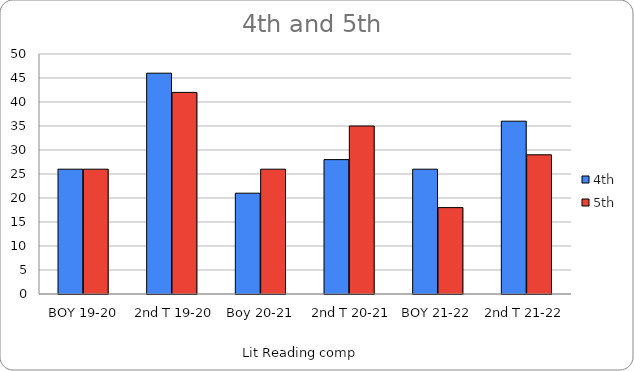
| Category | 4th | 5th |
|---|---|---|
|  BOY 19-20 | 26 | 26 |
|  2nd T 19-20 | 46 | 42 |
|  Boy 20-21 | 21 | 26 |
|  2nd T 20-21 | 28 | 35 |
| BOY 21-22 | 26 | 18 |
| 2nd T 21-22 | 36 | 29 |